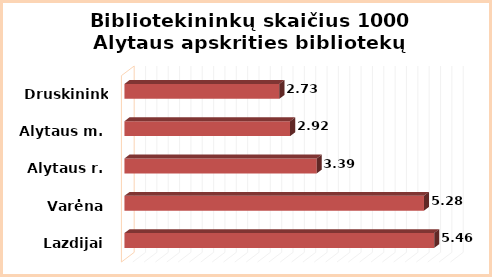
| Category | Series 0 |
|---|---|
| Lazdijai | 5.46 |
| Varėna | 5.28 |
| Alytaus r. | 3.39 |
| Alytaus m. | 2.92 |
| Druskininkai | 2.73 |